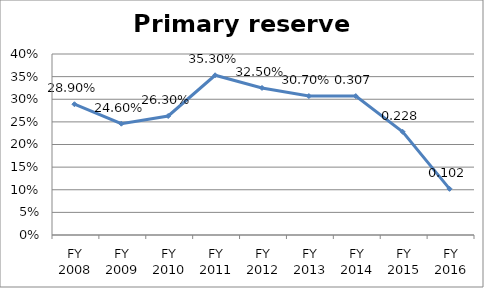
| Category | Primary reserve ratio |
|---|---|
| FY 2016 | 0.102 |
| FY 2015 | 0.228 |
| FY 2014 | 0.307 |
| FY 2013 | 0.307 |
| FY 2012 | 0.325 |
| FY 2011 | 0.353 |
| FY 2010 | 0.263 |
| FY 2009 | 0.246 |
| FY 2008 | 0.289 |